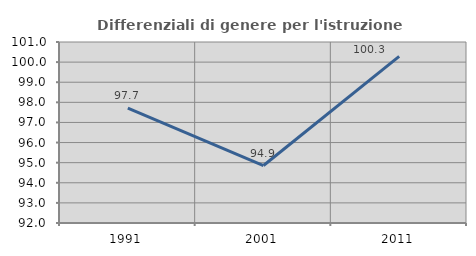
| Category | Differenziali di genere per l'istruzione superiore |
|---|---|
| 1991.0 | 97.706 |
| 2001.0 | 94.858 |
| 2011.0 | 100.285 |